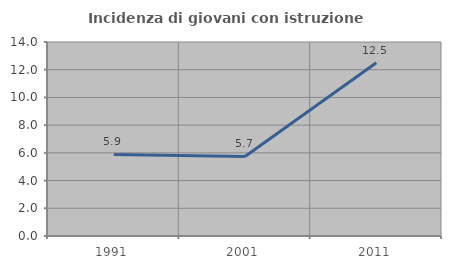
| Category | Incidenza di giovani con istruzione universitaria |
|---|---|
| 1991.0 | 5.882 |
| 2001.0 | 5.738 |
| 2011.0 | 12.5 |